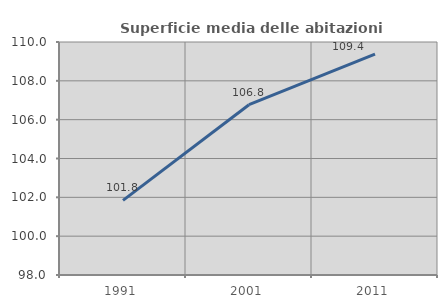
| Category | Superficie media delle abitazioni occupate |
|---|---|
| 1991.0 | 101.842 |
| 2001.0 | 106.772 |
| 2011.0 | 109.376 |